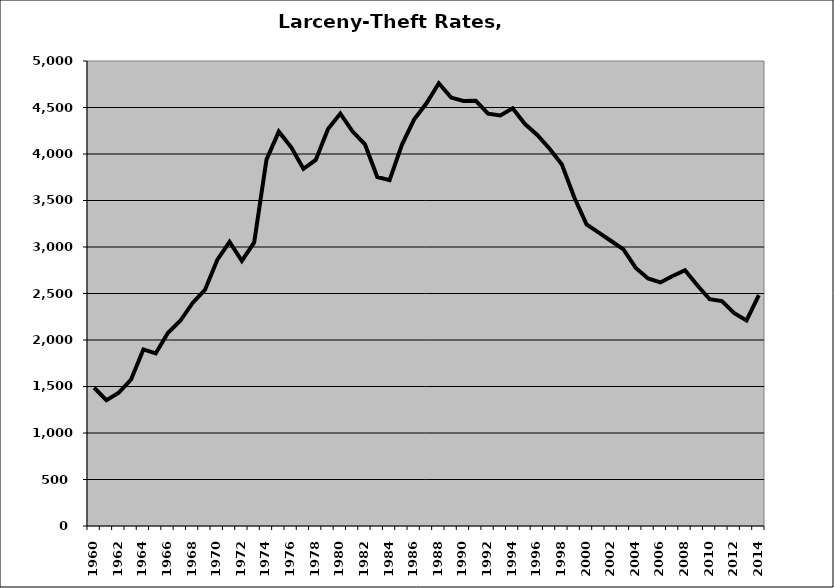
| Category | Larceny-Theft |
|---|---|
| 1960.0 | 1486.461 |
| 1961.0 | 1353.026 |
| 1962.0 | 1433.706 |
| 1963.0 | 1575.265 |
| 1964.0 | 1898.457 |
| 1965.0 | 1855.866 |
| 1966.0 | 2077.495 |
| 1967.0 | 2206.806 |
| 1968.0 | 2398.458 |
| 1969.0 | 2538.417 |
| 1970.0 | 2860.559 |
| 1971.0 | 3054.069 |
| 1972.0 | 2851.109 |
| 1973.0 | 3048.619 |
| 1974.0 | 3939.53 |
| 1975.0 | 4240.445 |
| 1976.0 | 4073.97 |
| 1977.0 | 3840.523 |
| 1978.0 | 3936.456 |
| 1979.0 | 4267.483 |
| 1980.0 | 4434.18 |
| 1981.0 | 4241.806 |
| 1982.0 | 4103.898 |
| 1983.0 | 3752.772 |
| 1984.0 | 3718.595 |
| 1985.0 | 4098.117 |
| 1986.0 | 4372.557 |
| 1987.0 | 4545.172 |
| 1988.0 | 4760.564 |
| 1989.0 | 4606.598 |
| 1990.0 | 4569.589 |
| 1991.0 | 4573.488 |
| 1992.0 | 4434.26 |
| 1993.0 | 4413.948 |
| 1994.0 | 4490.633 |
| 1995.0 | 4322.399 |
| 1996.0 | 4204.5 |
| 1997.0 | 4056.858 |
| 1998.0 | 3886.779 |
| 1999.0 | 3534.487 |
| 2000.0 | 3242.934 |
| 2001.0 | 3154.813 |
| 2002.0 | 3064.265 |
| 2003.0 | 2973.608 |
| 2004.0 | 2775.22 |
| 2005.0 | 2661.565 |
| 2006.0 | 2618.999 |
| 2007.0 | 2688.989 |
| 2008.0 | 2751.397 |
| 2009.0 | 2588.563 |
| 2010.0 | 2438.415 |
| 2011.0 | 2417.994 |
| 2012.0 | 2288.188 |
| 2013.0 | 2210.904 |
| 2014.0 | 2481.474 |